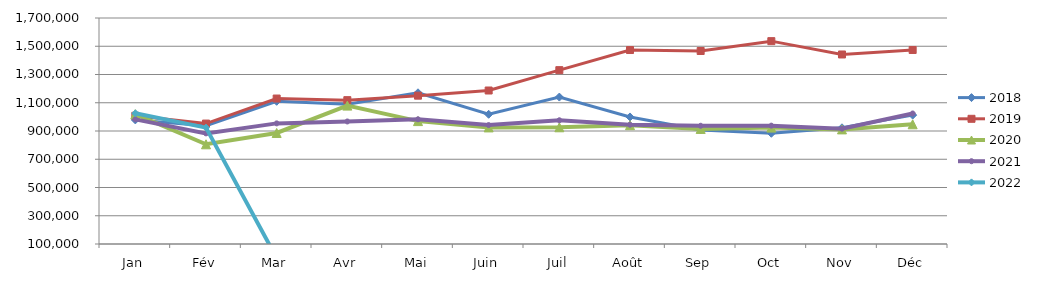
| Category | 2018 | 2019 | 2020 | 2021 | 2022 |
|---|---|---|---|---|---|
| Jan | 978468.279 | 1007982.373 | 1019103.465 | 982555.093 | 1025150.28 |
| Fév | 937137.209 | 952616.766 | 805837.355 | 883272.289 | 923686.154 |
| Mar | 1110199.711 | 1129815.679 | 886115.696 | 953969.676 | 0 |
| Avr | 1090229.308 | 1118398.221 | 1079723.465 | 967473.972 | 0 |
| Mai | 1170512.154 | 1150217.455 | 970040.088 | 982779.252 | 0 |
| Juin | 1018295.812 | 1186623.687 | 925406.896 | 941931.836 | 0 |
| Juil | 1140133.118 | 1330812.699 | 926286.755 | 976002.038 | 0 |
| Août | 999343.146 | 1473280.035 | 941195.84 | 944349.197 | 0 |
| Sep | 907808.882 | 1466448.158 | 914678.196 | 937034.569 | 0 |
| Oct | 883825.979 | 1536100.268 | 923984.732 | 937856.38 | 0 |
| Nov | 922678.039 | 1441770.199 | 911296.416 | 916487.725 | 0 |
| Déc | 1012620.724 | 1473565.92 | 947568.113 | 1024000.752 | 0 |